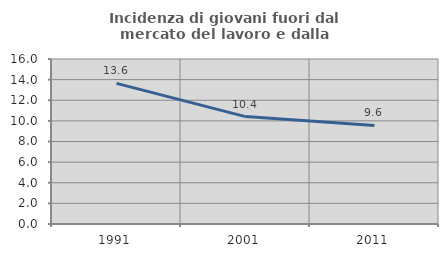
| Category | Incidenza di giovani fuori dal mercato del lavoro e dalla formazione  |
|---|---|
| 1991.0 | 13.632 |
| 2001.0 | 10.417 |
| 2011.0 | 9.561 |